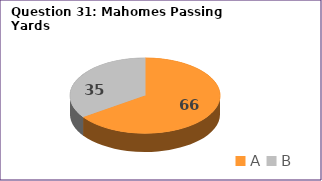
| Category | Series 0 |
|---|---|
| A | 66 |
| B | 35 |